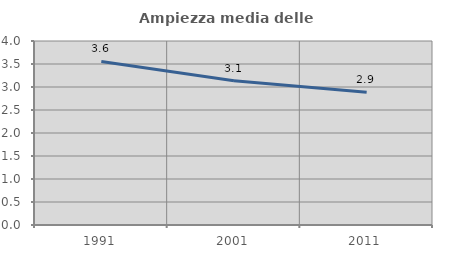
| Category | Ampiezza media delle famiglie |
|---|---|
| 1991.0 | 3.556 |
| 2001.0 | 3.135 |
| 2011.0 | 2.884 |